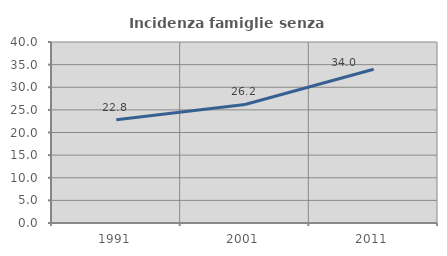
| Category | Incidenza famiglie senza nuclei |
|---|---|
| 1991.0 | 22.82 |
| 2001.0 | 26.194 |
| 2011.0 | 33.975 |